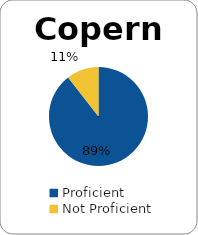
| Category | Series 0 |
|---|---|
| Proficient | 0.895 |
| Not Proficient | 0.105 |